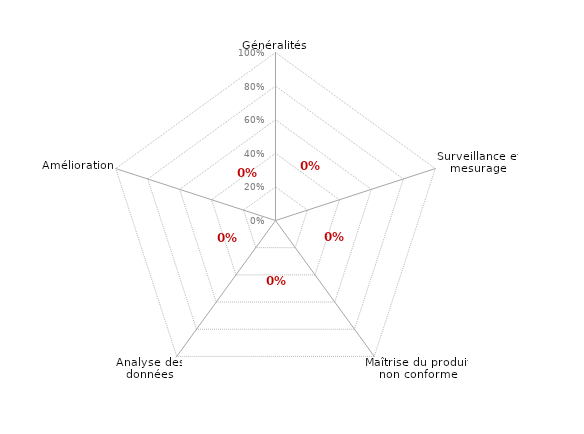
| Category | article 8 |
|---|---|
| 0 | 0 |
| 1 | 0 |
| 2 | 0 |
| 3 | 0 |
| 4 | 0 |